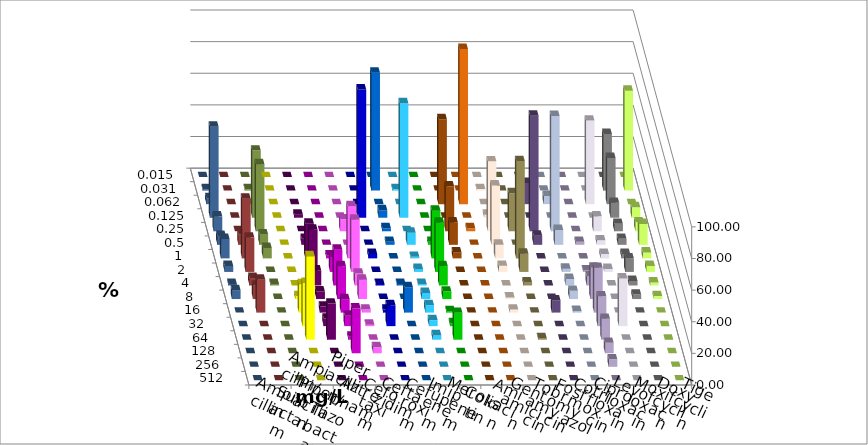
| Category | Ampicillin | Ampicillin/ Sulbactam | Piperacillin | Piperacillin/ Tazobactam | Aztreonam | Cefotaxim | Ceftazidim | Cefuroxim | Imipenem | Meropenem | Colistin | Amikacin | Gentamicin | Tobramycin | Fosfomycin | Cotrimoxazol | Ciprofloxacin | Levofloxacin | Moxifloxacin | Doxycyclin | Tigecyclin |
|---|---|---|---|---|---|---|---|---|---|---|---|---|---|---|---|---|---|---|---|---|---|
| 0.015 | 0 | 0 | 0 | 0 | 0 | 0 | 0 | 0 | 0 | 0 | 0 | 0 | 0 | 0 | 0 | 0 | 0 | 0 | 0 | 0 | 0 |
| 0.031 | 0 | 0 | 0 | 0 | 0 | 74.528 | 0.952 | 0 | 0 | 0 | 0.962 | 0 | 0 | 0 | 0 | 0 | 35.849 | 63.208 | 0.943 | 0 | 0.943 |
| 0.062 | 0 | 0 | 0 | 0 | 0 | 0 | 0 | 0 | 53.774 | 98.113 | 0 | 0 | 13.462 | 5.208 | 0 | 52.83 | 29.245 | 0 | 3.774 | 0 | 0 |
| 0.125 | 0 | 1.905 | 0 | 0 | 81.132 | 4.717 | 72.381 | 0 | 0 | 0 | 1.923 | 0 | 0 | 0 | 0 | 0 | 9.434 | 6.604 | 57.547 | 0 | 42.453 |
| 0.25 | 0 | 0 | 0 | 7.547 | 0 | 1.887 | 0 | 0 | 28.302 | 1.887 | 44.231 | 24.038 | 73.077 | 72.917 | 0 | 9.434 | 4.717 | 5.66 | 9.434 | 0 | 42.453 |
| 0.5 | 0 | 3.81 | 0 | 0 | 0 | 1.887 | 7.619 | 1.887 | 14.151 | 0 | 37.5 | 0 | 5.769 | 9.375 | 1.887 | 2.83 | 3.774 | 13.208 | 5.66 | 6.604 | 6.604 |
| 1.0 | 0 | 21.905 | 1.887 | 33.019 | 2.83 | 0 | 0.952 | 30.189 | 3.774 | 0 | 8.654 | 61.538 | 0 | 0 | 0 | 2.83 | 2.83 | 3.774 | 12.264 | 37.736 | 6.604 |
| 2.0 | 0 | 26.667 | 9.434 | 33.019 | 0 | 0 | 1.905 | 31.132 | 0 | 0 | 3.846 | 11.538 | 0 | 2.083 | 0.943 | 1.887 | 8.491 | 3.774 | 3.774 | 21.698 | 0 |
| 4.0 | 0 | 9.524 | 22.642 | 7.547 | 0.943 | 0.943 | 0.952 | 12.264 | 0 | 0 | 0 | 1.923 | 0 | 4.167 | 5.66 | 0 | 2.83 | 1.887 | 0.943 | 4.717 | 0.943 |
| 8.0 | 1.887 | 4.762 | 20.755 | 12.264 | 0 | 0 | 3.81 | 4.717 | 0 | 0 | 0.962 | 0 | 0 | 5.208 | 19.811 | 0 | 2.83 | 1.887 | 5.66 | 8.491 | 0 |
| 16.0 | 17.925 | 3.81 | 8.491 | 1.887 | 1.887 | 16.038 | 4.762 | 0.943 | 0 | 0 | 1.923 | 0 | 7.692 | 1.042 | 28.302 | 0 | 0 | 0 | 0 | 20.755 | 0 |
| 32.0 | 27.358 | 4.762 | 6.604 | 0.943 | 13.208 | 0 | 3.81 | 1.887 | 0 | 0 | 0 | 0 | 0 | 0 | 18.868 | 30.189 | 0 | 0 | 0 | 0 | 0 |
| 64.0 | 52.83 | 22.857 | 1.887 | 0 | 0 | 0 | 2.857 | 16.981 | 0 | 0 | 0 | 0.962 | 0 | 0 | 13.208 | 0 | 0 | 0 | 0 | 0 | 0 |
| 128.0 | 0 | 0 | 28.302 | 3.774 | 0 | 0 | 0 | 0 | 0 | 0 | 0 | 0 | 0 | 0 | 6.604 | 0 | 0 | 0 | 0 | 0 | 0 |
| 256.0 | 0 | 0 | 0 | 0 | 0 | 0 | 0 | 0 | 0 | 0 | 0 | 0 | 0 | 0 | 4.717 | 0 | 0 | 0 | 0 | 0 | 0 |
| 512.0 | 0 | 0 | 0 | 0 | 0 | 0 | 0 | 0 | 0 | 0 | 0 | 0 | 0 | 0 | 0 | 0 | 0 | 0 | 0 | 0 | 0 |